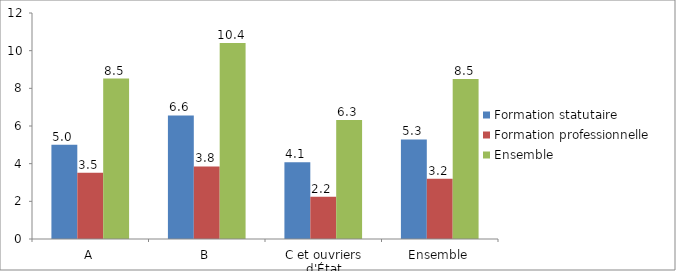
| Category | Formation statutaire | Formation professionnelle | Ensemble  |
|---|---|---|---|
| A | 5.002 | 3.52 | 8.522 |
| B | 6.559 | 3.85 | 10.409 |
| C et ouvriers d'État | 4.069 | 2.243 | 6.312 |
| Ensemble | 5.287 | 3.203 | 8.49 |